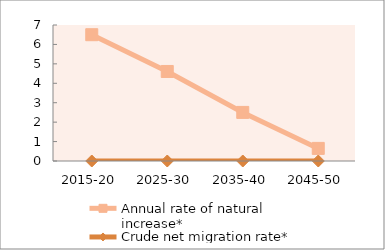
| Category | Annual rate of natural increase* | Crude net migration rate* |
|---|---|---|
| 2015-20 | 6.5 | 0 |
| 2025-30 | 4.608 | 0 |
| 2035-40 | 2.501 | 0 |
| 2045-50 | 0.649 | 0 |